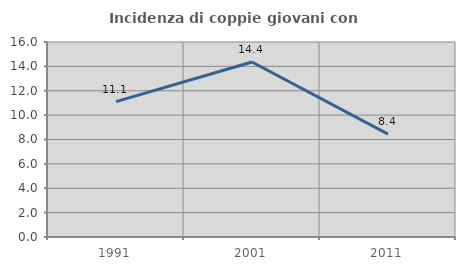
| Category | Incidenza di coppie giovani con figli |
|---|---|
| 1991.0 | 11.111 |
| 2001.0 | 14.356 |
| 2011.0 | 8.444 |